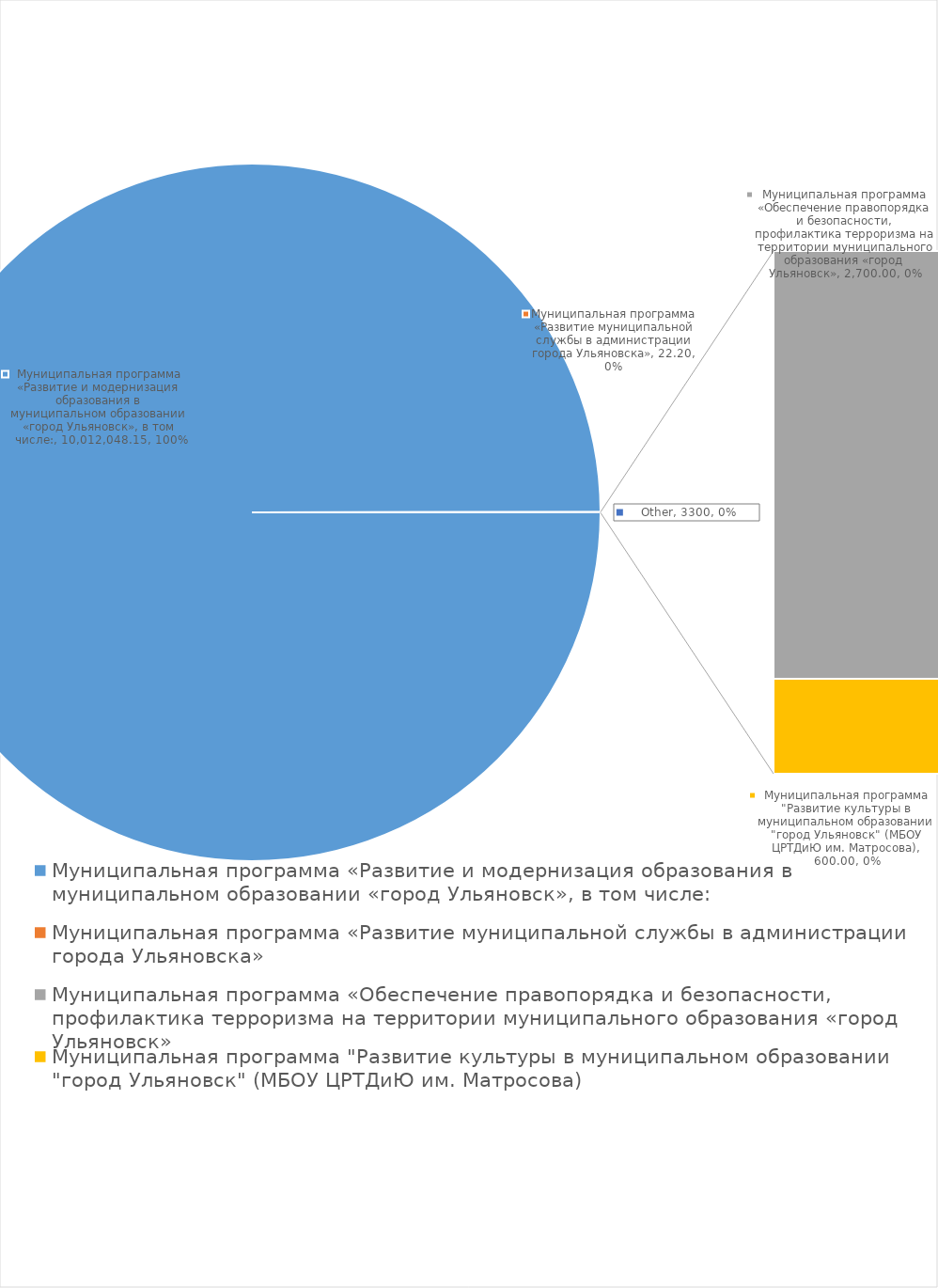
| Category | Series 0 |
|---|---|
| Муниципальная программа «Развитие и модернизация образования в муниципальном образовании «город Ульяновск», в том числе: | 10012048.15 |
| Муниципальная программа «Развитие муниципальной службы в администрации города Ульяновска» | 22.2 |
| Муниципальная программа «Обеспечение правопорядка и безопасности, профилактика терроризма на территории муниципального образования «город Ульяновск» | 2700 |
| Муниципальная программа "Развитие культуры в муниципальном образовании "город Ульяновск" (МБОУ ЦРТДиЮ им. Матросова) | 600 |